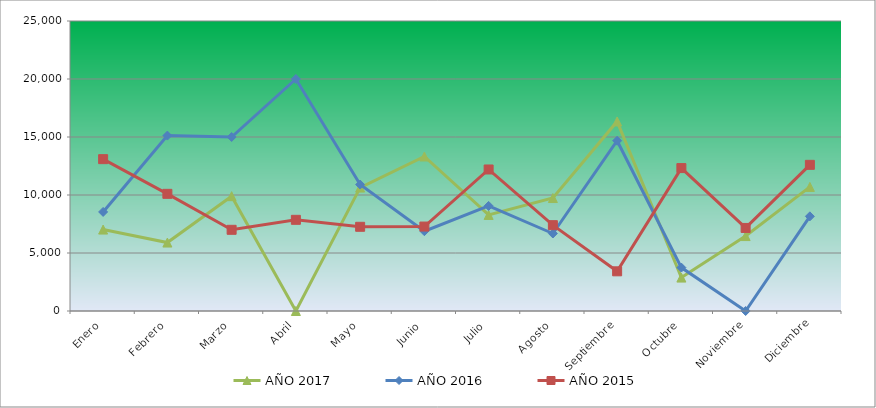
| Category | AÑO 2017 | AÑO 2016 | AÑO 2015 |
|---|---|---|---|
| Enero | 7020 | 8540 | 13090 |
| Febrero | 5900 | 15120 | 10100 |
| Marzo | 9900 | 15000 | 7000 |
| Abril | 0 | 20000 | 7860 |
| Mayo | 10640 | 10900 | 7260 |
| Junio | 13320 | 6880 | 7280 |
| Julio | 8280 | 9060 | 12200 |
| Agosto | 9740 | 6680 | 7400 |
| Septiembre | 16340 | 14680 | 3420 |
| Octubre | 2880 | 3740 | 12320 |
| Noviembre | 6460 | 0 | 7160 |
| Diciembre | 10700 | 8160 | 12600 |